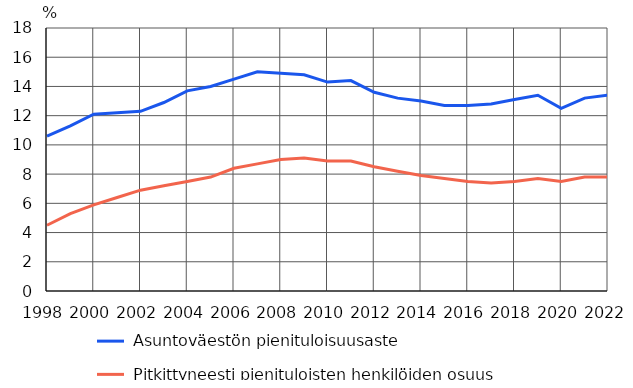
| Category |  Asuntoväestön pienituloisuusaste |  Pitkittyneesti pienituloisten henkilöiden osuus asuntoväestössä 1) |
|---|---|---|
| 1998 | 10.6 | 4.5 |
| 1999 | 11.3 | 5.3 |
| 2000 | 12.1 | 5.9 |
| 2001 | 12.2 | 6.4 |
| 2002 | 12.3 | 6.9 |
| 2003 | 12.9 | 7.2 |
| 2004 | 13.7 | 7.5 |
| 2005 | 14 | 7.8 |
| 2006 | 14.5 | 8.4 |
| 2007 | 15 | 8.7 |
| 2008 | 14.9 | 9 |
| 2009 | 14.8 | 9.1 |
| 2010 | 14.3 | 8.9 |
| 2011 | 14.4 | 8.9 |
| 2012 | 13.6 | 8.5 |
| 2013 | 13.2 | 8.2 |
| 2014 | 13 | 7.9 |
| 2015 | 12.7 | 7.7 |
| 2016 | 12.7 | 7.5 |
| 2017 | 12.8 | 7.4 |
| 2018 | 13.1 | 7.5 |
| 2019 | 13.4 | 7.7 |
| 2020 | 12.5 | 7.5 |
| 2021 | 13.2 | 7.8 |
| 2022 | 13.4 | 7.8 |